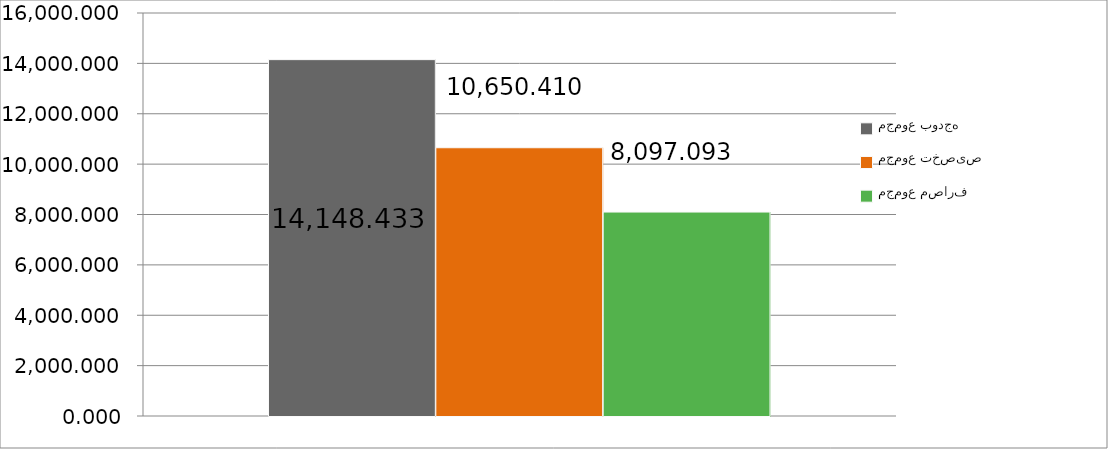
| Category | مجموع بودجه  | مجموع تخصیص | مجموع مصارف |
|---|---|---|---|
| 0 | 14148.433 | 10650.41 | 8097.093 |